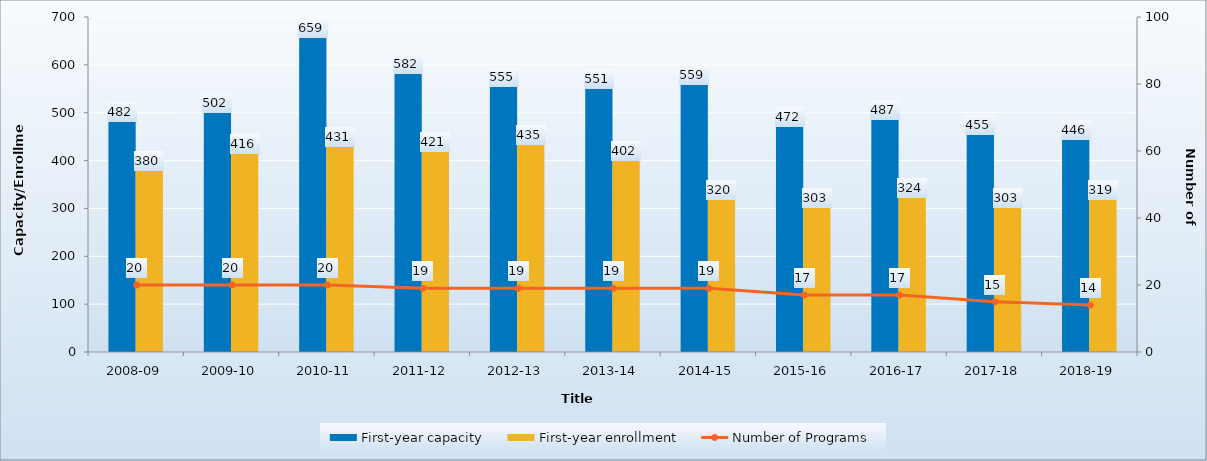
| Category | First-year capacity | First-year enrollment |
|---|---|---|
| 2008-09 | 482 | 380 |
| 2009-10 | 502 | 416 |
| 2010-11 | 659 | 431 |
| 2011-12 | 582 | 421 |
| 2012-13 | 555 | 435 |
| 2013-14 | 551 | 402 |
| 2014-15 | 559 | 320 |
| 2015-16 | 472 | 303 |
| 2016-17 | 487 | 324 |
| 2017-18 | 455 | 303 |
| 2018-19 | 446 | 319 |